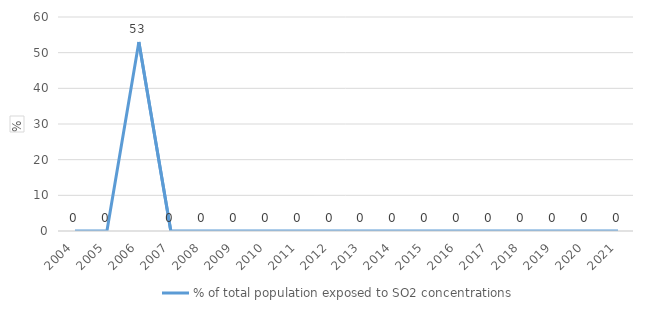
| Category | % of total population exposed to SO2 concentrations  |
|---|---|
| 2004.0 | 0 |
| 2005.0 | 0 |
| 2006.0 | 53.001 |
| 2007.0 | 0 |
| 2008.0 | 0 |
| 2009.0 | 0 |
| 2010.0 | 0 |
| 2011.0 | 0 |
| 2012.0 | 0 |
| 2013.0 | 0 |
| 2014.0 | 0 |
| 2015.0 | 0 |
| 2016.0 | 0 |
| 2017.0 | 0 |
| 2018.0 | 0 |
| 2019.0 | 0 |
| 2020.0 | 0 |
| 2021.0 | 0 |